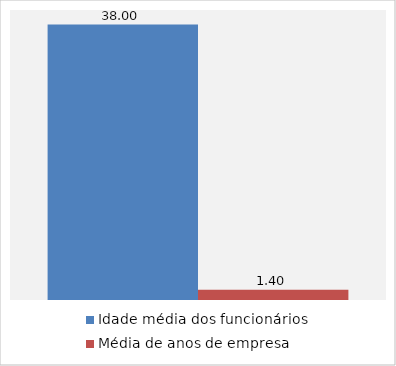
| Category | Idade média dos funcionários | Média de anos de empresa |
|---|---|---|
| Médias | 38 | 1.4 |